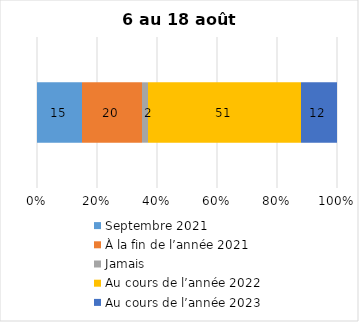
| Category | Septembre 2021 | À la fin de l’année 2021 | Jamais | Au cours de l’année 2022 | Au cours de l’année 2023 |
|---|---|---|---|---|---|
| 0 | 15 | 20 | 2 | 51 | 12 |